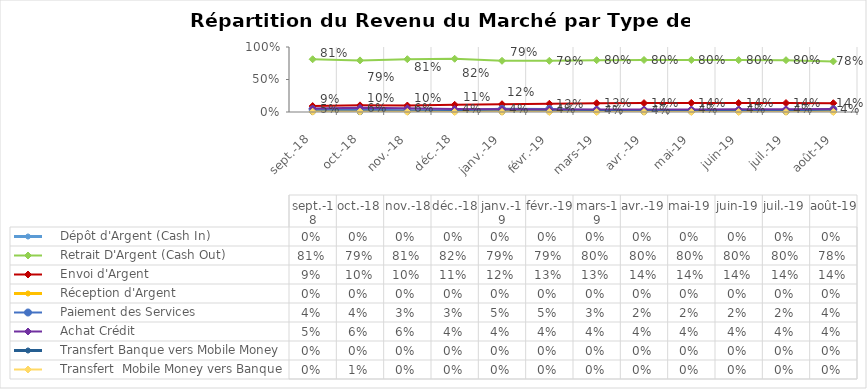
| Category |     Dépôt d'Argent (Cash In) |     Retrait D'Argent (Cash Out)  |     Envoi d'Argent  |     Réception d'Argent |     Paiement des Services |     Achat Crédit |     Transfert Banque vers Mobile Money |     Transfert  Mobile Money vers Banque  |
|---|---|---|---|---|---|---|---|---|
| 2018-09-01 | 0 | 0.811 | 0.091 | 0 | 0.04 | 0.052 | 0 | 0.005 |
| 2018-10-01 | 0 | 0.794 | 0.102 | 0 | 0.035 | 0.064 | 0 | 0.005 |
| 2018-11-01 | 0 | 0.812 | 0.099 | 0 | 0.029 | 0.057 | 0 | 0.002 |
| 2018-12-01 | 0 | 0.819 | 0.11 | 0 | 0.025 | 0.045 | 0 | 0.001 |
| 2019-01-01 | 0 | 0.788 | 0.119 | 0 | 0.048 | 0.044 | 0 | 0.001 |
| 2019-02-01 | 0 | 0.788 | 0.126 | 0 | 0.047 | 0.039 | 0 | 0 |
| 2019-03-01 | 0 | 0.797 | 0.134 | 0 | 0.03 | 0.038 | 0 | 0 |
| 2019-04-01 | 0 | 0.8 | 0.137 | 0 | 0.024 | 0.038 | 0 | 0 |
| 2019-05-01 | 0 | 0.8 | 0.14 | 0 | 0.021 | 0.039 | 0 | 0 |
| 2019-06-01 | 0 | 0.799 | 0.138 | 0 | 0.023 | 0.041 | 0 | 0 |
| 2019-07-01 | 0 | 0.797 | 0.138 | 0 | 0.021 | 0.043 | 0 | 0 |
| 2019-08-01 | 0 | 0.778 | 0.135 | 0 | 0.042 | 0.045 | 0 | 0 |